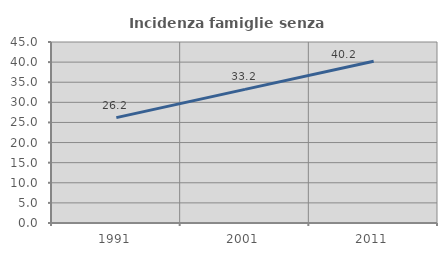
| Category | Incidenza famiglie senza nuclei |
|---|---|
| 1991.0 | 26.19 |
| 2001.0 | 33.223 |
| 2011.0 | 40.194 |